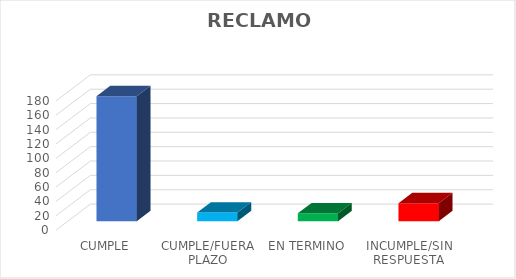
| Category | Series 0 |
|---|---|
| CUMPLE | 174 |
| CUMPLE/FUERA PLAZO | 12 |
| EN TERMINO | 11 |
| INCUMPLE/SIN RESPUESTA | 25 |